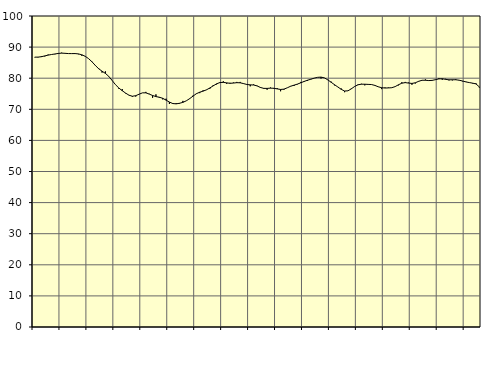
| Category | Piggar | Series 1 |
|---|---|---|
| nan | 86.7 | 86.77 |
| 87.0 | 86.7 | 86.78 |
| 87.0 | 87.1 | 86.91 |
| 87.0 | 87 | 87.17 |
| nan | 87.6 | 87.42 |
| 88.0 | 87.6 | 87.62 |
| 88.0 | 87.7 | 87.79 |
| 88.0 | 88.1 | 87.96 |
| nan | 88.2 | 88.06 |
| 89.0 | 88 | 88 |
| 89.0 | 87.9 | 87.92 |
| 89.0 | 87.9 | 87.91 |
| nan | 88 | 87.92 |
| 90.0 | 87.7 | 87.81 |
| 90.0 | 87.2 | 87.53 |
| 90.0 | 87.1 | 87.04 |
| nan | 86.3 | 86.29 |
| 91.0 | 85.4 | 85.28 |
| 91.0 | 84.2 | 84.11 |
| 91.0 | 83.2 | 83.04 |
| nan | 81.8 | 82.25 |
| 92.0 | 82.2 | 81.54 |
| 92.0 | 80.5 | 80.58 |
| 92.0 | 79.3 | 79.26 |
| nan | 77.9 | 77.9 |
| 93.0 | 76.6 | 76.83 |
| 93.0 | 76.5 | 75.97 |
| 93.0 | 75.1 | 75.21 |
| nan | 74.5 | 74.53 |
| 94.0 | 74 | 74.2 |
| 94.0 | 74.1 | 74.38 |
| 94.0 | 74.9 | 74.85 |
| nan | 75.3 | 75.29 |
| 95.0 | 75.6 | 75.3 |
| 95.0 | 75 | 74.89 |
| 95.0 | 73.7 | 74.44 |
| nan | 74.8 | 74.09 |
| 96.0 | 73.7 | 73.88 |
| 96.0 | 73.2 | 73.54 |
| 96.0 | 73.4 | 72.95 |
| nan | 71.7 | 72.32 |
| 97.0 | 72 | 71.85 |
| 97.0 | 72 | 71.75 |
| 97.0 | 71.8 | 71.94 |
| nan | 72.7 | 72.23 |
| 98.0 | 72.7 | 72.72 |
| 98.0 | 73.5 | 73.42 |
| 98.0 | 74.4 | 74.24 |
| nan | 75.1 | 75.01 |
| 99.0 | 75.2 | 75.5 |
| 99.0 | 76.1 | 75.84 |
| 99.0 | 76.2 | 76.26 |
| nan | 76.6 | 76.86 |
| 0.0 | 77.8 | 77.54 |
| 0.0 | 78 | 78.2 |
| 0.0 | 78.5 | 78.6 |
| nan | 79 | 78.66 |
| 1.0 | 78.2 | 78.5 |
| 1.0 | 78.5 | 78.36 |
| 1.0 | 78.6 | 78.44 |
| nan | 78.8 | 78.56 |
| 2.0 | 78.8 | 78.52 |
| 2.0 | 78.2 | 78.27 |
| 2.0 | 77.9 | 77.98 |
| nan | 77.4 | 77.86 |
| 3.0 | 78 | 77.81 |
| 3.0 | 77.6 | 77.53 |
| 3.0 | 76.9 | 77.03 |
| nan | 76.6 | 76.73 |
| 4.0 | 76.3 | 76.72 |
| 4.0 | 77 | 76.8 |
| 4.0 | 76.6 | 76.76 |
| nan | 76.8 | 76.56 |
| 5.0 | 75.8 | 76.38 |
| 5.0 | 76.3 | 76.48 |
| 5.0 | 76.9 | 76.92 |
| nan | 77.5 | 77.42 |
| 6.0 | 77.5 | 77.76 |
| 6.0 | 78 | 78.1 |
| 6.0 | 78.8 | 78.52 |
| nan | 78.8 | 78.96 |
| 7.0 | 79.1 | 79.35 |
| 7.0 | 79.6 | 79.68 |
| 7.0 | 80 | 80.02 |
| nan | 80.3 | 80.28 |
| 8.0 | 79.9 | 80.35 |
| 8.0 | 80.1 | 80.11 |
| 8.0 | 79.4 | 79.48 |
| nan | 78.9 | 78.7 |
| 9.0 | 77.7 | 77.92 |
| 9.0 | 77.2 | 77.18 |
| 9.0 | 76.7 | 76.42 |
| nan | 75.5 | 75.88 |
| 10.0 | 75.9 | 75.94 |
| 10.0 | 76.7 | 76.58 |
| 10.0 | 77.4 | 77.35 |
| nan | 78 | 77.88 |
| 11.0 | 78.2 | 78.07 |
| 11.0 | 77.7 | 78.06 |
| 11.0 | 78.1 | 78.01 |
| nan | 78 | 77.96 |
| 12.0 | 77.6 | 77.68 |
| 12.0 | 77.2 | 77.24 |
| 12.0 | 76.5 | 76.94 |
| nan | 77 | 76.84 |
| 13.0 | 77 | 76.87 |
| 13.0 | 76.9 | 76.94 |
| 13.0 | 77.3 | 77.29 |
| nan | 77.7 | 77.89 |
| 14.0 | 78.7 | 78.39 |
| 14.0 | 78.8 | 78.58 |
| 14.0 | 78.6 | 78.43 |
| nan | 77.9 | 78.32 |
| 15.0 | 78.3 | 78.53 |
| 15.0 | 79.1 | 79 |
| 15.0 | 79.3 | 79.34 |
| nan | 79.6 | 79.34 |
| 16.0 | 79.3 | 79.24 |
| 16.0 | 79.2 | 79.3 |
| 16.0 | 79.6 | 79.53 |
| nan | 80 | 79.78 |
| 17.0 | 79.5 | 79.82 |
| 17.0 | 79.8 | 79.63 |
| 17.0 | 79.3 | 79.48 |
| nan | 79.3 | 79.5 |
| 18.0 | 79.7 | 79.5 |
| 18.0 | 79.3 | 79.36 |
| 18.0 | 79 | 79.1 |
| nan | 78.9 | 78.81 |
| 19.0 | 78.6 | 78.6 |
| 19.0 | 78.3 | 78.41 |
| 19.0 | 78.4 | 78.17 |
| nan | 77 | 77.21 |